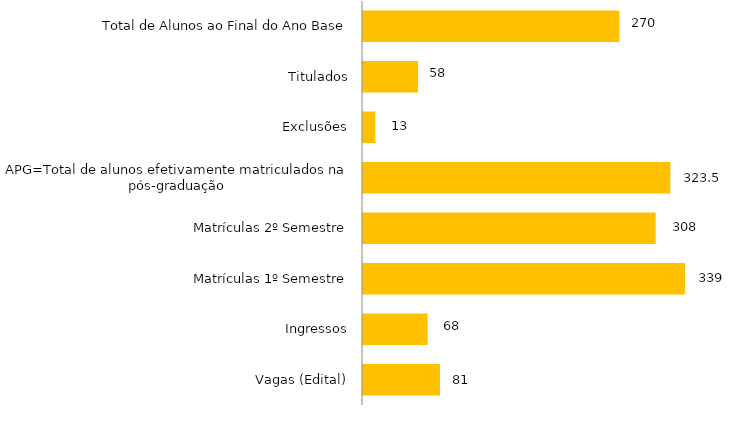
| Category | Curso |
|---|---|
| Vagas (Edital) | 81 |
| Ingressos | 68 |
| Matrículas 1º Semestre | 339 |
| Matrículas 2º Semestre | 308 |
| APG=Total de alunos efetivamente matriculados na pós-graduação | 323.5 |
| Exclusões | 13 |
| Titulados | 58 |
| Total de Alunos ao Final do Ano Base | 270 |